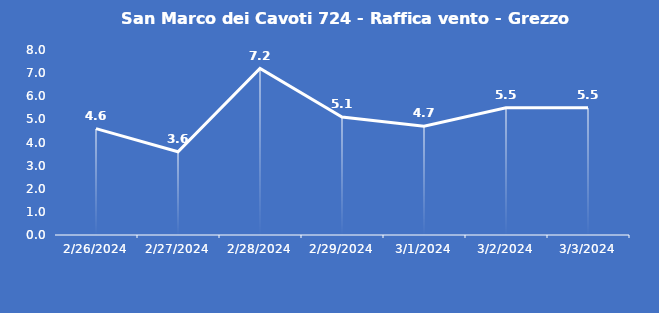
| Category | San Marco dei Cavoti 724 - Raffica vento - Grezzo (m/s) |
|---|---|
| 2/26/24 | 4.6 |
| 2/27/24 | 3.6 |
| 2/28/24 | 7.2 |
| 2/29/24 | 5.1 |
| 3/1/24 | 4.7 |
| 3/2/24 | 5.5 |
| 3/3/24 | 5.5 |